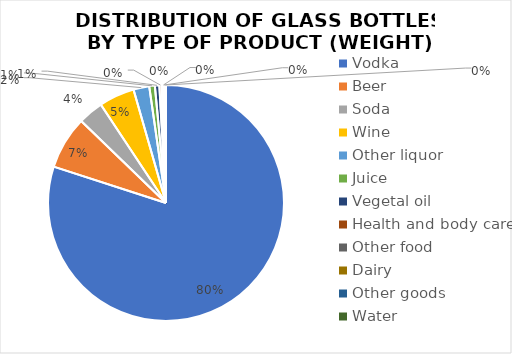
| Category | Series 0 |
|---|---|
| Vodka | 1109.38 |
| Beer | 100.45 |
| Soda | 47.959 |
| Wine | 67.62 |
| Other liquor | 30 |
| Juice | 10.64 |
| Vegetal oil | 8.45 |
| Health and body care | 4.3 |
| Other food | 2.8 |
| Dairy | 1.15 |
| Other goods | 1.4 |
| Water | 2.85 |